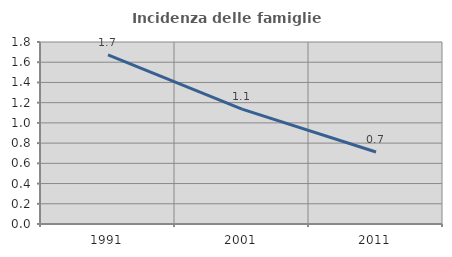
| Category | Incidenza delle famiglie numerose |
|---|---|
| 1991.0 | 1.672 |
| 2001.0 | 1.136 |
| 2011.0 | 0.712 |